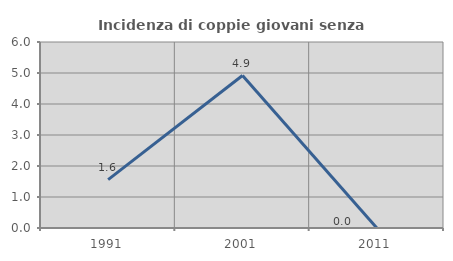
| Category | Incidenza di coppie giovani senza figli |
|---|---|
| 1991.0 | 1.562 |
| 2001.0 | 4.918 |
| 2011.0 | 0 |